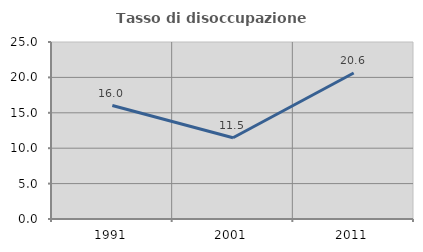
| Category | Tasso di disoccupazione giovanile  |
|---|---|
| 1991.0 | 16.024 |
| 2001.0 | 11.47 |
| 2011.0 | 20.619 |